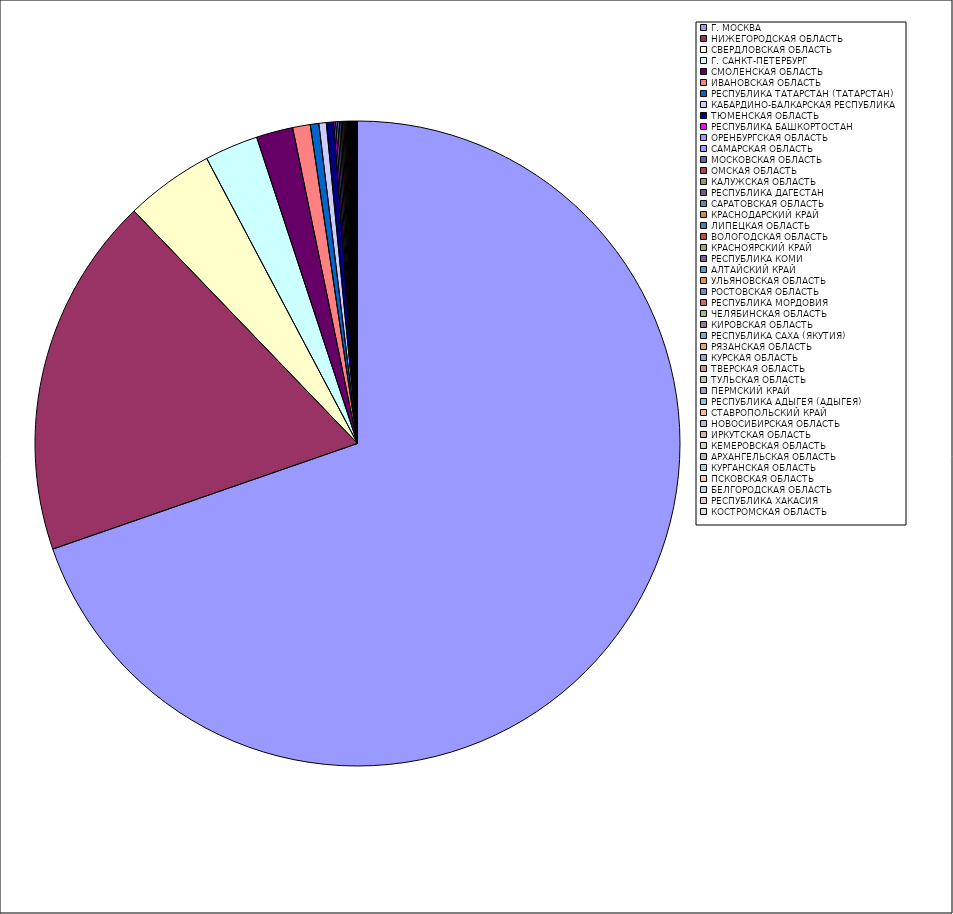
| Category | Оборот |
|---|---|
| Г. МОСКВА | 69.673 |
| НИЖЕГОРОДСКАЯ ОБЛАСТЬ | 18.116 |
| СВЕРДЛОВСКАЯ ОБЛАСТЬ | 4.443 |
| Г. САНКТ-ПЕТЕРБУРГ | 2.682 |
| СМОЛЕНСКАЯ ОБЛАСТЬ | 1.836 |
| ИВАНОВСКАЯ ОБЛАСТЬ | 0.881 |
| РЕСПУБЛИКА ТАТАРСТАН (ТАТАРСТАН) | 0.427 |
| КАБАРДИНО-БАЛКАРСКАЯ РЕСПУБЛИКА | 0.374 |
| ТЮМЕНСКАЯ ОБЛАСТЬ | 0.37 |
| РЕСПУБЛИКА БАШКОРТОСТАН | 0.095 |
| ОРЕНБУРГСКАЯ ОБЛАСТЬ | 0.09 |
| САМАРСКАЯ ОБЛАСТЬ | 0.086 |
| МОСКОВСКАЯ ОБЛАСТЬ | 0.083 |
| ОМСКАЯ ОБЛАСТЬ | 0.07 |
| КАЛУЖСКАЯ ОБЛАСТЬ | 0.067 |
| РЕСПУБЛИКА ДАГЕСТАН | 0.059 |
| САРАТОВСКАЯ ОБЛАСТЬ | 0.056 |
| КРАСНОДАРСКИЙ КРАЙ | 0.046 |
| ЛИПЕЦКАЯ ОБЛАСТЬ | 0.04 |
| ВОЛОГОДСКАЯ ОБЛАСТЬ | 0.039 |
| КРАСНОЯРСКИЙ КРАЙ | 0.036 |
| РЕСПУБЛИКА КОМИ | 0.036 |
| АЛТАЙСКИЙ КРАЙ | 0.035 |
| УЛЬЯНОВСКАЯ ОБЛАСТЬ | 0.031 |
| РОСТОВСКАЯ ОБЛАСТЬ | 0.029 |
| РЕСПУБЛИКА МОРДОВИЯ | 0.025 |
| ЧЕЛЯБИНСКАЯ ОБЛАСТЬ | 0.023 |
| КИРОВСКАЯ ОБЛАСТЬ | 0.022 |
| РЕСПУБЛИКА САХА (ЯКУТИЯ) | 0.022 |
| РЯЗАНСКАЯ ОБЛАСТЬ | 0.02 |
| КУРСКАЯ ОБЛАСТЬ | 0.019 |
| ТВЕРСКАЯ ОБЛАСТЬ | 0.017 |
| ТУЛЬСКАЯ ОБЛАСТЬ | 0.015 |
| ПЕРМСКИЙ КРАЙ | 0.015 |
| РЕСПУБЛИКА АДЫГЕЯ (АДЫГЕЯ) | 0.013 |
| СТАВРОПОЛЬСКИЙ КРАЙ | 0.011 |
| НОВОСИБИРСКАЯ ОБЛАСТЬ | 0.011 |
| ИРКУТСКАЯ ОБЛАСТЬ | 0.01 |
| КЕМЕРОВСКАЯ ОБЛАСТЬ | 0.01 |
| АРХАНГЕЛЬСКАЯ ОБЛАСТЬ | 0.008 |
| КУРГАНСКАЯ ОБЛАСТЬ | 0.008 |
| ПСКОВСКАЯ ОБЛАСТЬ | 0.007 |
| БЕЛГОРОДСКАЯ ОБЛАСТЬ | 0.007 |
| РЕСПУБЛИКА ХАКАСИЯ | 0.006 |
| КОСТРОМСКАЯ ОБЛАСТЬ | 0.005 |